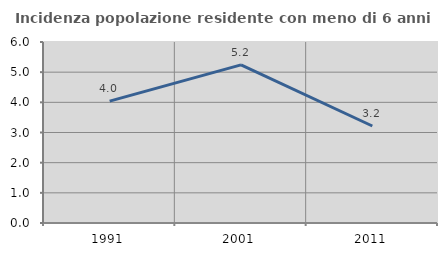
| Category | Incidenza popolazione residente con meno di 6 anni |
|---|---|
| 1991.0 | 4.039 |
| 2001.0 | 5.241 |
| 2011.0 | 3.215 |